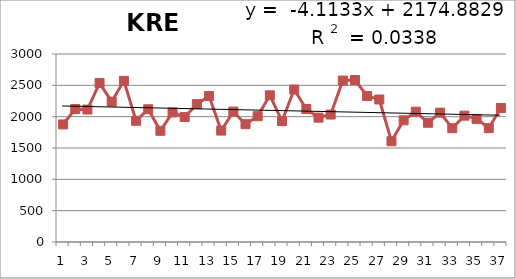
| Category | 1976-2012 |
|---|---|
| 0 | 1876 |
| 1 | 2122 |
| 2 | 2114 |
| 3 | 2536 |
| 4 | 2239 |
| 5 | 2572 |
| 6 | 1934 |
| 7 | 2118 |
| 8 | 1775 |
| 9 | 2068 |
| 10 | 1994 |
| 11 | 2200 |
| 12 | 2330 |
| 13 | 1778 |
| 14 | 2081 |
| 15 | 1880 |
| 16 | 2007 |
| 17 | 2341 |
| 18 | 1929 |
| 19 | 2433 |
| 20 | 2122 |
| 21 | 1984 |
| 22 | 2034 |
| 23 | 2576 |
| 24 | 2585 |
| 25 | 2330 |
| 26 | 2274 |
| 27 | 1608 |
| 28 | 1942 |
| 29 | 2079 |
| 30 | 1903 |
| 31 | 2064 |
| 32 | 1816 |
| 33 | 2016 |
| 34 | 1964 |
| 35 | 1817 |
| 36 | 2138 |